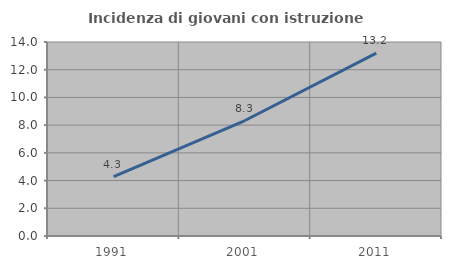
| Category | Incidenza di giovani con istruzione universitaria |
|---|---|
| 1991.0 | 4.277 |
| 2001.0 | 8.333 |
| 2011.0 | 13.198 |